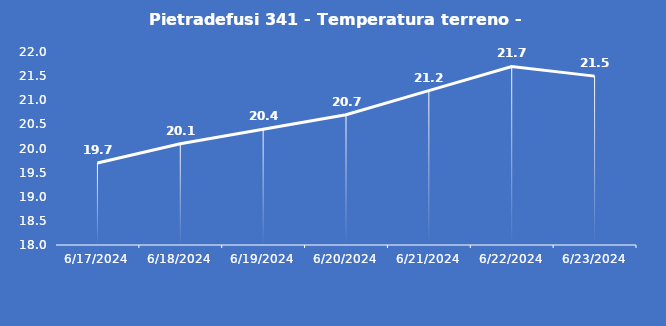
| Category | Pietradefusi 341 - Temperatura terreno - Grezzo (°C) |
|---|---|
| 6/17/24 | 19.7 |
| 6/18/24 | 20.1 |
| 6/19/24 | 20.4 |
| 6/20/24 | 20.7 |
| 6/21/24 | 21.2 |
| 6/22/24 | 21.7 |
| 6/23/24 | 21.5 |